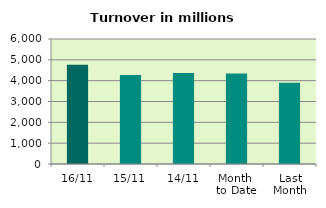
| Category | Series 0 |
|---|---|
| 16/11 | 4769.488 |
| 15/11 | 4274.282 |
| 14/11 | 4372.067 |
| Month 
to Date | 4342.35 |
| Last
Month | 3895.685 |